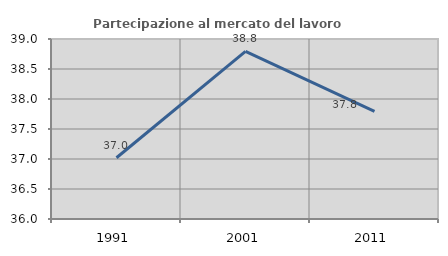
| Category | Partecipazione al mercato del lavoro  femminile |
|---|---|
| 1991.0 | 37.021 |
| 2001.0 | 38.794 |
| 2011.0 | 37.795 |